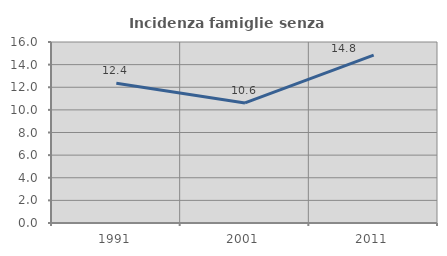
| Category | Incidenza famiglie senza nuclei |
|---|---|
| 1991.0 | 12.355 |
| 2001.0 | 10.614 |
| 2011.0 | 14.835 |